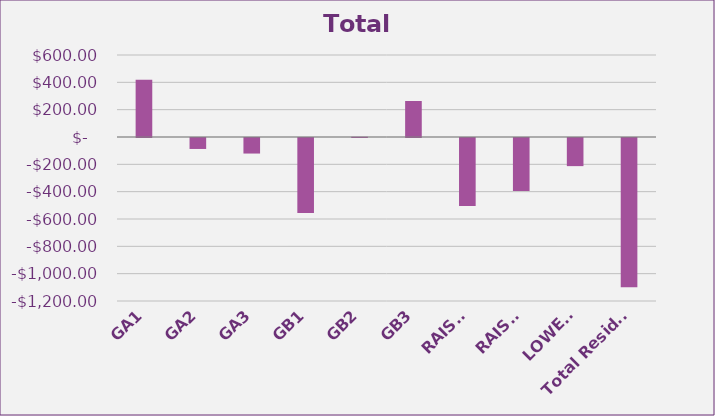
| Category | Series 0 |
|---|---|
| 0 | 418.747 |
| 1 | -80.211 |
| 2 | -113.762 |
| 3 | -547.884 |
| 4 | 1.802 |
| 5 | 263.378 |
| 6 | -498.038 |
| 7 | -388.235 |
| 8 | -205.797 |
| 9 | -1092.07 |